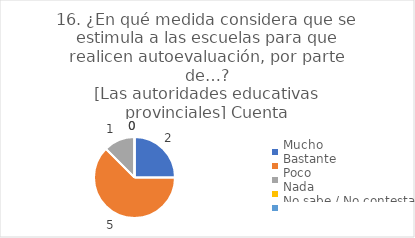
| Category | 16. ¿En qué medida considera que se estimula a las escuelas para que realicen autoevaluación, por parte de…?
[Las autoridades educativas provinciales] |
|---|---|
| Mucho  | 0.25 |
| Bastante  | 0.625 |
| Poco  | 0.125 |
| Nada  | 0 |
| No sabe / No contesta | 0 |